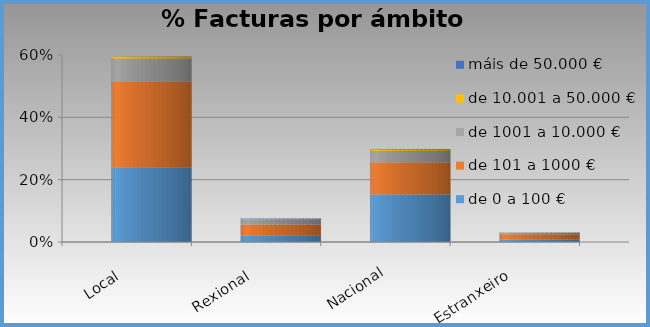
| Category | de 0 a 100 € | de 101 a 1000 € | de 1001 a 10.000 € | de 10.001 a 50.000 € | máis de 50.000 € |
|---|---|---|---|---|---|
| Local | 0.238 | 0.277 | 0.073 | 0.007 | 0.001 |
| Rexional | 0.02 | 0.036 | 0.017 | 0.001 | 0.001 |
| Nacional | 0.153 | 0.103 | 0.037 | 0.005 | 0.001 |
| Estranxeiro | 0.008 | 0.017 | 0.006 | 0 | 0 |